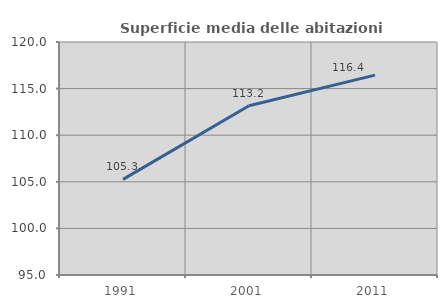
| Category | Superficie media delle abitazioni occupate |
|---|---|
| 1991.0 | 105.263 |
| 2001.0 | 113.165 |
| 2011.0 | 116.449 |